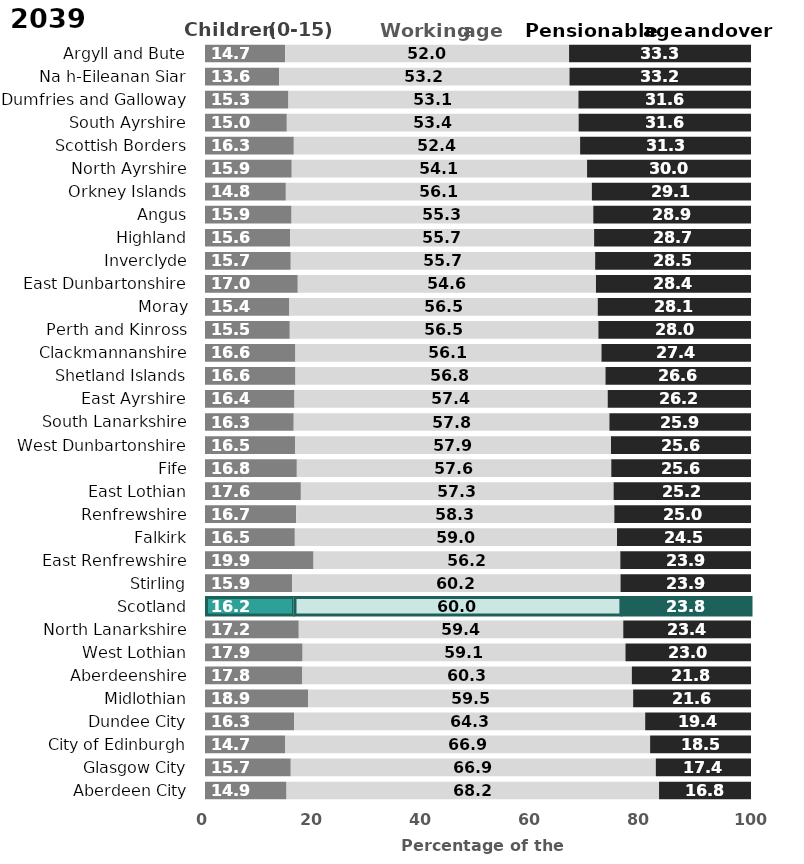
| Category | Series 4 | Series 5 | Series 6 |
|---|---|---|---|
| Argyll and Bute | 14.666 | 52.015 | 33.319 |
| Na h-Eileanan Siar | 13.591 | 53.162 | 33.247 |
| Dumfries and Galloway | 15.28 | 53.117 | 31.603 |
| South Ayrshire | 14.986 | 53.445 | 31.569 |
| Scottish Borders | 16.268 | 52.433 | 31.299 |
| North Ayrshire | 15.888 | 54.088 | 30.023 |
| Orkney Islands | 14.807 | 56.05 | 29.143 |
| Angus | 15.856 | 55.258 | 28.886 |
| Highland | 15.574 | 55.693 | 28.733 |
| Inverclyde | 15.706 | 55.75 | 28.544 |
| East Dunbartonshire | 16.991 | 54.614 | 28.395 |
| Moray | 15.45 | 56.485 | 28.065 |
| Perth and Kinross | 15.53 | 56.52 | 27.95 |
| Clackmannanshire | 16.56 | 56.057 | 27.383 |
| Shetland Islands | 16.57 | 56.781 | 26.65 |
| East Ayrshire | 16.39 | 57.368 | 26.243 |
| South Lanarkshire | 16.251 | 57.817 | 25.931 |
| West Dunbartonshire | 16.482 | 57.875 | 25.642 |
| Fife | 16.82 | 57.587 | 25.593 |
| East Lothian | 17.56 | 57.284 | 25.156 |
| Renfrewshire | 16.703 | 58.265 | 25.032 |
| Falkirk | 16.452 | 59.008 | 24.54 |
| East Renfrewshire | 19.883 | 56.181 | 23.936 |
| Stirling | 15.948 | 60.157 | 23.895 |
| Scotland | 16.209 | 59.962 | 23.829 |
| North Lanarkshire | 17.177 | 59.428 | 23.396 |
| West Lothian | 17.877 | 59.131 | 22.992 |
| Aberdeenshire | 17.832 | 60.347 | 21.821 |
| Midlothian | 18.88 | 59.535 | 21.586 |
| Dundee City | 16.35 | 64.269 | 19.381 |
| City of Edinburgh | 14.656 | 66.868 | 18.476 |
| Glasgow City | 15.708 | 66.861 | 17.431 |
| Aberdeen City | 14.932 | 68.228 | 16.84 |